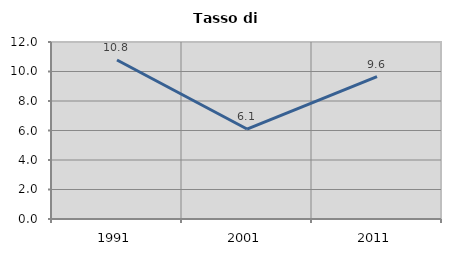
| Category | Tasso di disoccupazione   |
|---|---|
| 1991.0 | 10.779 |
| 2001.0 | 6.1 |
| 2011.0 | 9.647 |